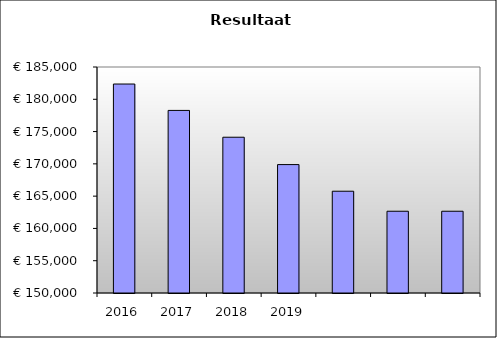
| Category | Series 0 |
|---|---|
| 2016.0 | 182362.541 |
| 2017.0 | 178275.625 |
| 2018.0 | 174123.817 |
| 2019.0 | 169887.228 |